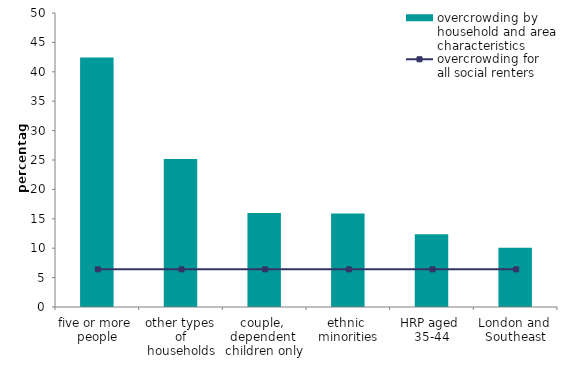
| Category | overcrowding by household and area characteristics |
|---|---|
| five or more 
people | 42.421 |
| other types 
of households | 25.184 |
| couple, 
dependent 
children only | 15.98 |
| ethnic 
minorities | 15.903 |
| HRP aged 
35-44 | 12.367 |
| London and 
Southeast | 10.086 |